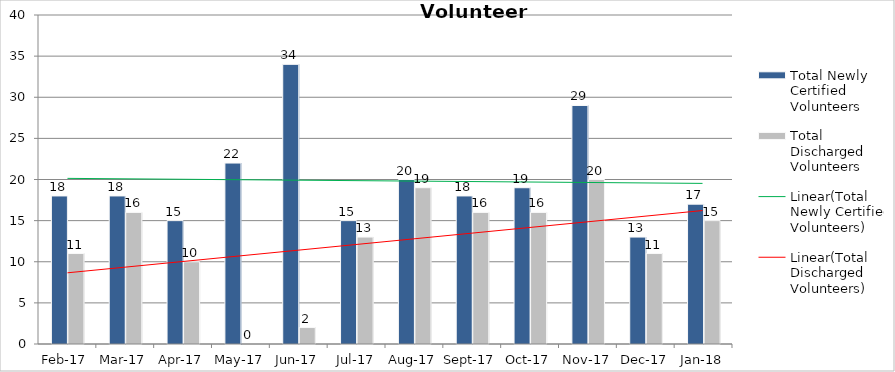
| Category | Total Newly Certified Volunteers | Total Discharged Volunteers |
|---|---|---|
| 2017-02-01 | 18 | 11 |
| 2017-03-01 | 18 | 16 |
| 2017-04-01 | 15 | 10 |
| 2017-05-01 | 22 | 0 |
| 2017-06-01 | 34 | 2 |
| 2017-07-01 | 15 | 13 |
| 2017-08-01 | 20 | 19 |
| 2017-09-01 | 18 | 16 |
| 2017-10-01 | 19 | 16 |
| 2017-11-01 | 29 | 20 |
| 2017-12-01 | 13 | 11 |
| 2018-01-01 | 17 | 15 |